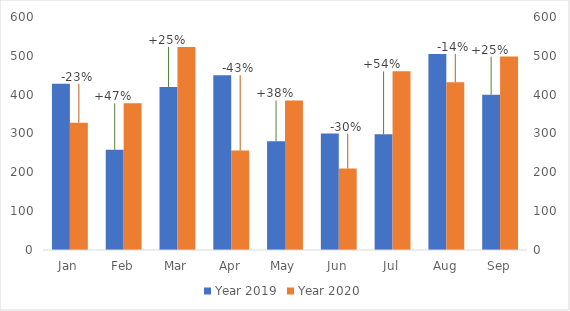
| Category | Year 2019 | Year 2020 |
|---|---|---|
| Jan | 428 | 328 |
| Feb | 258 | 378 |
| Mar | 420 | 523 |
| Apr | 450 | 256 |
| May | 280 | 385 |
| Jun | 300 | 210 |
| Jul | 298 | 460 |
| Aug | 505 | 432 |
| Sep | 400 | 498 |